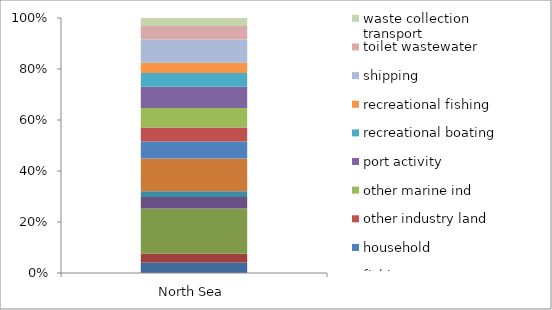
| Category | agriculture | aquaculture | coast beach tourism | construction and demolition | dumps and landfills | fishing | household | other industry land | other marine ind | port activity | recreational boating | recreational fishing | shipping | toilet wastewater | waste collection transport |
|---|---|---|---|---|---|---|---|---|---|---|---|---|---|---|---|
| North Sea | 75830.75 | 61807.75 | 323328.5 | 82483.75 | 41262.25 | 233631 | 122817.25 | 100277.5 | 139505 | 151129.75 | 98141.75 | 73667.5 | 167031 | 95836 | 57699.25 |